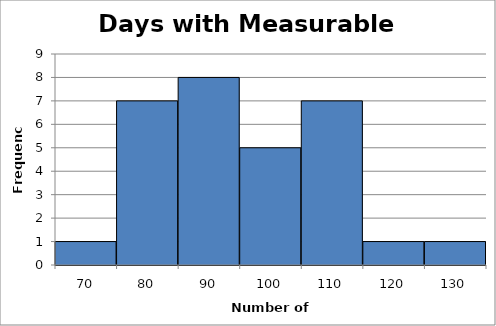
| Category | Series 0 |
|---|---|
| 70.0 | 1 |
| 80.0 | 7 |
| 90.0 | 8 |
| 100.0 | 5 |
| 110.0 | 7 |
| 120.0 | 1 |
| 130.0 | 1 |